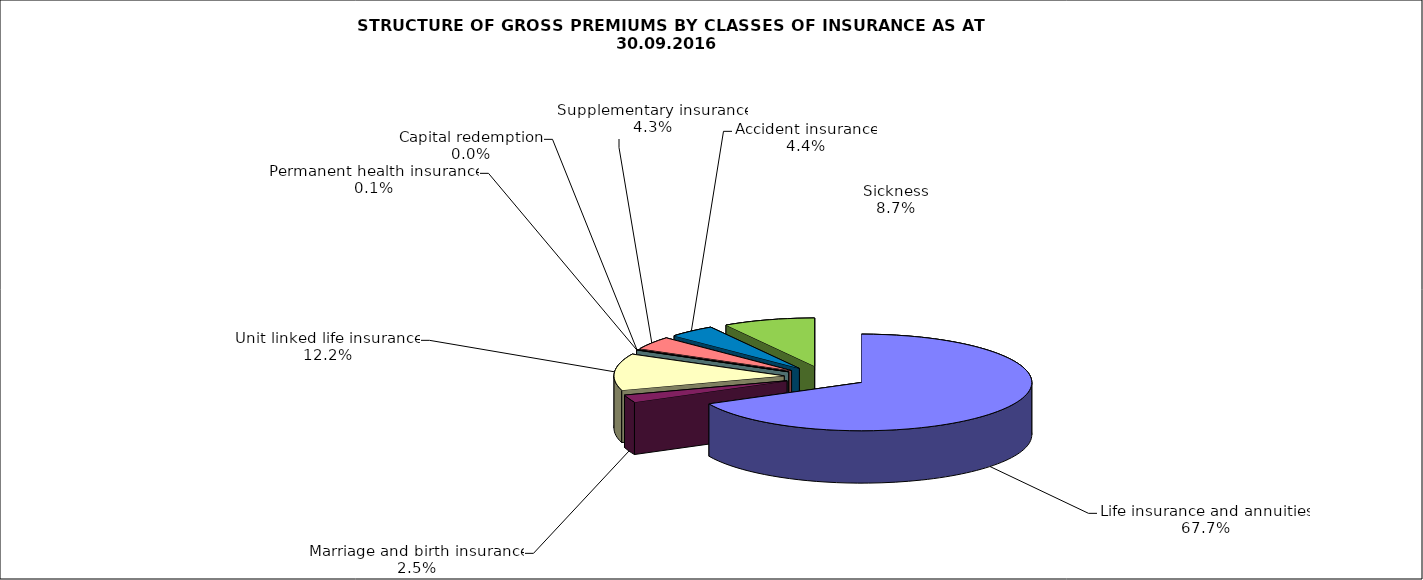
| Category | Series 0 |
|---|---|
| Life insurance and annuities | 220794698.14 |
| Marriage and birth insurance | 8198382.687 |
| Unit linked life insurance | 39870071.144 |
| Permanent health insurance | 236445.43 |
| Capital redemption | 0 |
| Supplementary insurance | 14112993.593 |
| Accident insurance | 14493613.86 |
| Sickness | 28446865.76 |